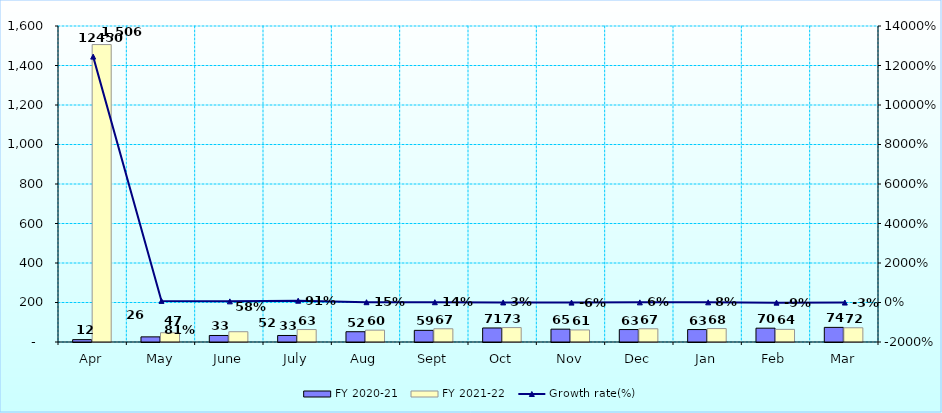
| Category | FY 2020-21 | FY 2021-22 |
|---|---|---|
| Apr | 12 | 1506 |
| May | 26 | 47 |
| June | 33 | 52 |
| July | 33 | 63 |
| Aug | 52 | 60 |
| Sept | 59 | 67 |
| Oct | 71 | 73 |
| Nov | 65 | 61 |
| Dec | 63 | 67 |
| Jan | 63 | 68 |
| Feb | 70 | 64 |
| Mar | 74 | 72 |